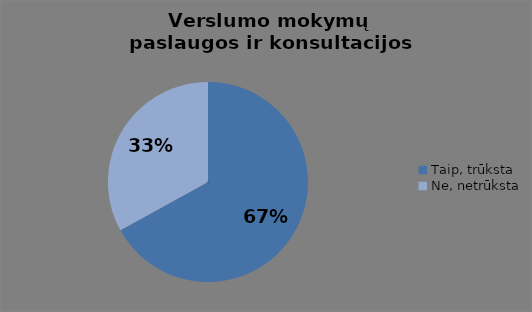
| Category | Series 0 |
|---|---|
| Taip, trūksta | 73 |
| Ne, netrūksta | 36 |